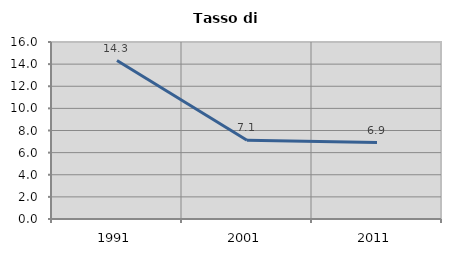
| Category | Tasso di disoccupazione   |
|---|---|
| 1991.0 | 14.325 |
| 2001.0 | 7.121 |
| 2011.0 | 6.905 |